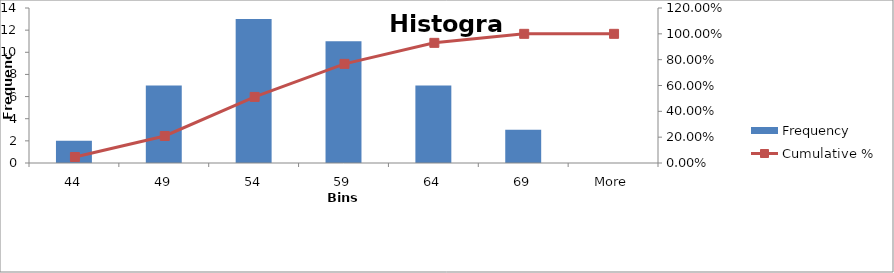
| Category | Frequency |
|---|---|
| 44 | 2 |
| 49 | 7 |
| 54 | 13 |
| 59 | 11 |
| 64 | 7 |
| 69 | 3 |
| More | 0 |